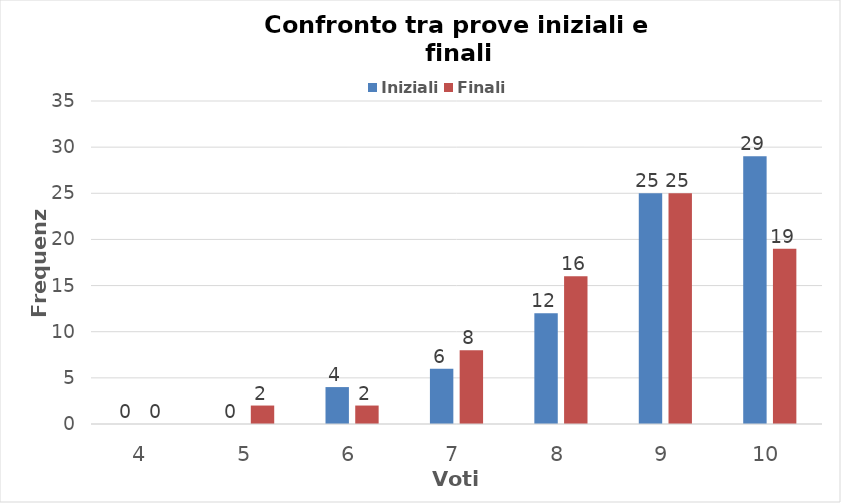
| Category | Iniziali | Finali |
|---|---|---|
| 4.0 | 0 | 0 |
| 5.0 | 0 | 2 |
| 6.0 | 4 | 2 |
| 7.0 | 6 | 8 |
| 8.0 | 12 | 16 |
| 9.0 | 25 | 25 |
| 10.0 | 29 | 19 |